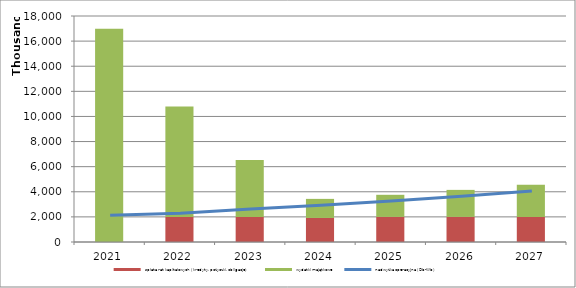
| Category | spłata rat kapitałowych (kredyty, pożyczki, obligacje) | wydatki majątkowe |
|---|---|---|
| 2021.0 | 0 | 16978022 |
| 2022.0 | 2000000 | 8785193 |
| 2023.0 | 2000000 | 4524441 |
| 2024.0 | 1915000 | 1519167 |
| 2025.0 | 2000000 | 1758958 |
| 2026.0 | 2000000 | 2151208 |
| 2027.0 | 2000000 | 2562900 |